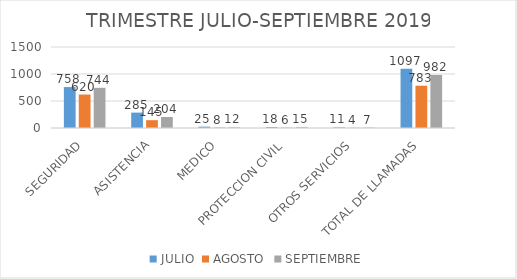
| Category | JULIO | AGOSTO | SEPTIEMBRE |
|---|---|---|---|
| SEGURIDAD | 758 | 620 | 744 |
| ASISTENCIA | 285 | 145 | 204 |
| MEDICO | 25 | 8 | 12 |
| PROTECCION CIVIL | 18 | 6 | 15 |
| OTROS SERVICIOS | 11 | 4 | 7 |
| TOTAL DE LLAMADAS | 1097 | 783 | 982 |